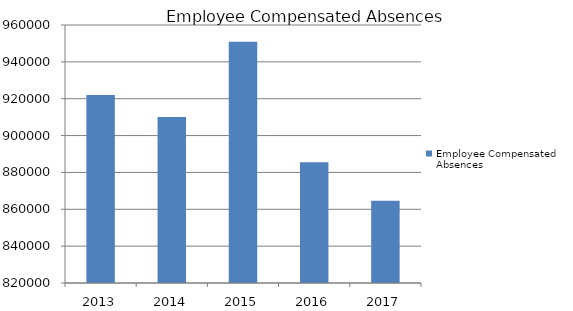
| Category |  Employee Compensated Absences  |
|---|---|
| 2013.0 | 921961 |
| 2014.0 | 910050 |
| 2015.0 | 950975 |
| 2016.0 | 885511 |
| 2017.0 | 864570 |